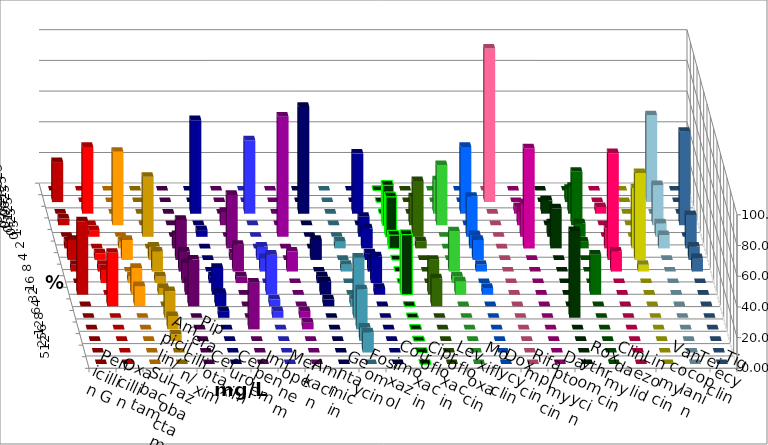
| Category | Penicillin G | Oxacillin | Ampicillin/ Sulbactam | Piperacillin/ Tazobactam | Cefotaxim | Cefuroxim | Imipenem | Meropenem | Amikacin | Gentamicin | Fosfomycin | Cotrimoxazol | Ciprofloxacin | Levofloxacin | Moxifloxacin | Doxycyclin | Rifampicin | Daptomycin | Roxythromycin | Clindamycin | Linezolid | Vancomycin | Teicoplanin | Tigecyclin |
|---|---|---|---|---|---|---|---|---|---|---|---|---|---|---|---|---|---|---|---|---|---|---|---|---|
| 0.015625 | 0 | 0 | 0 | 0 | 0 | 0 | 0 | 0 | 0 | 0 | 0 | 0 | 0 | 0 | 0 | 0 | 0 | 0 | 0 | 0 | 0 | 0 | 0 | 0 |
| 0.03125 | 26.087 | 0 | 0 | 0 | 0 | 0 | 0 | 0 | 0 | 0 | 0 | 0 | 0 | 0 | 0 | 0 | 100 | 0 | 0 | 8.696 | 0 | 0 | 0 | 56.522 |
| 0.0625 | 0 | 43.478 | 0 | 0 | 0 | 0 | 60.87 | 47.826 | 0 | 69.565 | 0 | 39.13 | 0 | 0 | 21.739 | 43.478 | 0 | 4.348 | 8.696 | 17.391 | 4.348 | 0 | 0 | 0 |
| 0.125 | 4.348 | 0 | 47.826 | 0 | 0 | 8.696 | 0 | 0 | 0 | 0 | 0 | 0 | 26.087 | 18.182 | 39.13 | 0 | 0 | 8.696 | 0 | 34.783 | 0 | 0 | 60.87 | 26.087 |
| 0.25 | 0 | 4.348 | 0 | 39.13 | 0 | 0 | 4.348 | 0 | 78.261 | 0 | 0 | 13.043 | 26.087 | 36.364 | 0 | 26.087 | 0 | 21.739 | 8.696 | 8.696 | 0 | 0 | 0 | 8.696 |
| 0.5 | 4.348 | 0 | 4.348 | 0 | 8.696 | 34.783 | 0 | 0 | 0 | 0 | 4.348 | 13.043 | 8.696 | 4.545 | 0 | 8.696 | 0 | 65.217 | 26.087 | 4.348 | 13.043 | 39.13 | 21.739 | 8.696 |
| 1.0 | 13.043 | 4.348 | 13.043 | 8.696 | 26.087 | 4.348 | 0 | 8.696 | 0 | 13.043 | 0 | 4.348 | 0 | 0 | 0 | 13.043 | 0 | 0 | 0 | 0 | 69.565 | 56.522 | 8.696 | 0 |
| 2.0 | 4.348 | 4.348 | 0 | 13.043 | 13.043 | 17.391 | 0 | 8.696 | 13.043 | 0 | 4.348 | 8.696 | 0 | 0 | 26.087 | 4.348 | 0 | 0 | 0 | 0 | 13.043 | 4.348 | 8.696 | 0 |
| 4.0 | 0 | 8.696 | 4.348 | 4.348 | 13.043 | 4.348 | 4.348 | 0 | 0 | 4.348 | 0 | 17.391 | 0 | 0 | 4.348 | 0 | 0 | 0 | 0 | 0 | 0 | 0 | 0 | 0 |
| 8.0 | 47.826 | 0 | 17.391 | 4.348 | 8.696 | 0 | 17.391 | 26.087 | 0 | 8.696 | 0 | 4.348 | 39.13 | 22.727 | 8.696 | 4.348 | 0 | 0 | 0 | 26.087 | 0 | 0 | 0 | 0 |
| 16.0 | 0 | 34.783 | 13.043 | 0 | 30.435 | 0 | 8.696 | 4.348 | 0 | 4.348 | 4.348 | 0 | 0 | 18.182 | 0 | 0 | 0 | 0 | 0 | 0 | 0 | 0 | 0 | 0 |
| 32.0 | 0 | 0 | 0 | 17.391 | 0 | 0 | 4.348 | 4.348 | 4.348 | 0 | 39.13 | 0 | 0 | 0 | 0 | 0 | 0 | 0 | 56.522 | 0 | 0 | 0 | 0 | 0 |
| 64.0 | 0 | 0 | 0 | 8.696 | 0 | 30.435 | 0 | 0 | 4.348 | 0 | 26.087 | 0 | 0 | 0 | 0 | 0 | 0 | 0 | 0 | 0 | 0 | 0 | 0 | 0 |
| 128.0 | 0 | 0 | 0 | 4.348 | 0 | 0 | 0 | 0 | 0 | 0 | 8.696 | 0 | 0 | 0 | 0 | 0 | 0 | 0 | 0 | 0 | 0 | 0 | 0 | 0 |
| 256.0 | 0 | 0 | 0 | 0 | 0 | 0 | 0 | 0 | 0 | 0 | 13.043 | 0 | 0 | 0 | 0 | 0 | 0 | 0 | 0 | 0 | 0 | 0 | 0 | 0 |
| 512.0 | 0 | 0 | 0 | 0 | 0 | 0 | 0 | 0 | 0 | 0 | 0 | 0 | 0 | 0 | 0 | 0 | 0 | 0 | 0 | 0 | 0 | 0 | 0 | 0 |